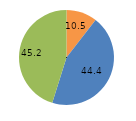
| Category | Series 0 |
|---|---|
| 0 | 10.5 |
| 1 | 44.4 |
| 2 | 45.2 |